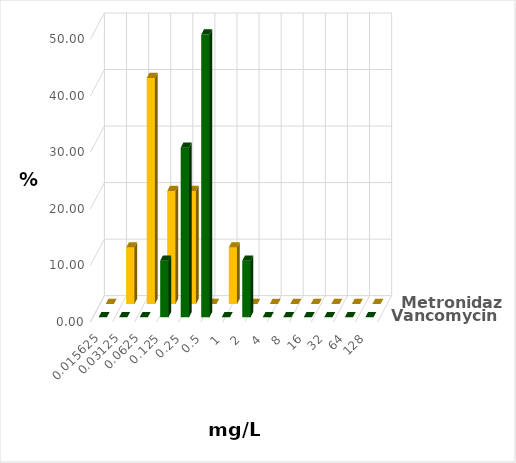
| Category | Vancomycin | Metronidazol |
|---|---|---|
| 0.015625 | 0 | 0 |
| 0.03125 | 0 | 10 |
| 0.0625 | 0 | 40 |
| 0.125 | 10 | 20 |
| 0.25 | 30 | 20 |
| 0.5 | 50 | 0 |
| 1.0 | 0 | 10 |
| 2.0 | 10 | 0 |
| 4.0 | 0 | 0 |
| 8.0 | 0 | 0 |
| 16.0 | 0 | 0 |
| 32.0 | 0 | 0 |
| 64.0 | 0 | 0 |
| 128.0 | 0 | 0 |